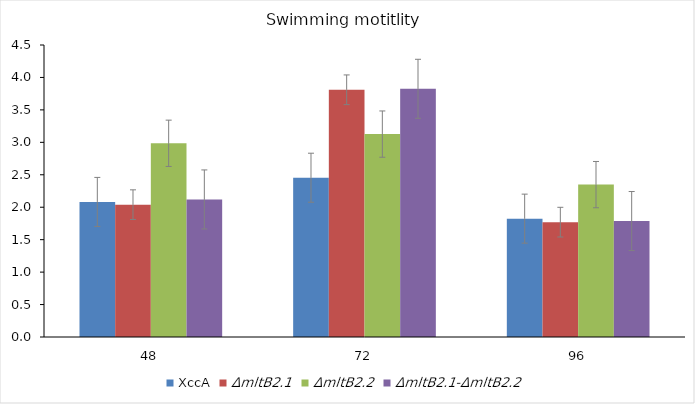
| Category | XccA | ΔmltB2.1 | ΔmltB2.2 | ΔmltB2.1-ΔmltB2.2 |
|---|---|---|---|---|
| 48.0 | 2.082 | 2.039 | 2.985 | 2.12 |
| 72.0 | 2.455 | 3.81 | 3.127 | 3.825 |
| 96.0 | 1.824 | 1.77 | 2.348 | 1.787 |